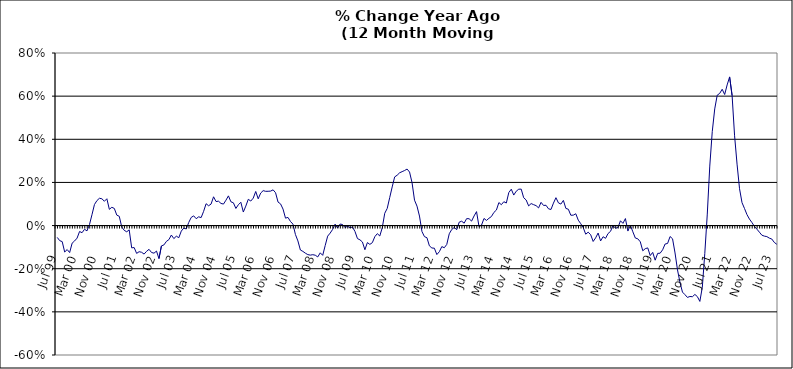
| Category | Series 0 |
|---|---|
| Jul 99 | -0.055 |
| Aug 99 | -0.07 |
| Sep 99 | -0.074 |
| Oct 99 | -0.123 |
| Nov 99 | -0.111 |
| Dec 99 | -0.125 |
| Jan 00 | -0.082 |
| Feb 00 | -0.071 |
| Mar 00 | -0.058 |
| Apr 00 | -0.027 |
| May 00 | -0.033 |
| Jun 00 | -0.017 |
| Jul 00 | -0.025 |
| Aug 00 | 0.005 |
| Sep 00 | 0.05 |
| Oct 00 | 0.098 |
| Nov 00 | 0.116 |
| Dec 00 | 0.127 |
| Jan 01 | 0.124 |
| Feb 01 | 0.113 |
| Mar 01 | 0.124 |
| Apr 01 | 0.075 |
| May 01 | 0.085 |
| Jun 01 | 0.08 |
| Jul 01 | 0.048 |
| Aug 01 | 0.043 |
| Sep 01 | -0.007 |
| Oct 01 | -0.022 |
| Nov 01 | -0.029 |
| Dec 01 | -0.02 |
| Jan 02 | -0.103 |
| Feb 02 | -0.102 |
| Mar 02 | -0.129 |
| Apr 02 | -0.121 |
| May 02 | -0.124 |
| Jun 02 | -0.132 |
| Jul 02 | -0.119 |
| Aug 02 | -0.11 |
| Sep 02 | -0.125 |
| Oct 02 | -0.128 |
| Nov 02 | -0.118 |
| Dec 02 | -0.153 |
| Jan 03 | -0.094 |
| Feb 03 | -0.09 |
| Mar 03 | -0.073 |
| Apr 03 | -0.065 |
| May 03 | -0.044 |
| Jun 03 | -0.06 |
| Jul 03 | -0.049 |
| Aug 03 | -0.056 |
| Sep 03 | -0.026 |
| Oct 03 | -0.012 |
| Nov 03 | -0.016 |
| Dec 03 | 0.014 |
| Jan 04 | 0.038 |
| Feb 04 | 0.045 |
| Mar 04 | 0.032 |
| Apr 04 | 0.041 |
| May 04 | 0.037 |
| Jun 04 | 0.066 |
| Jul 04 | 0.101 |
| Aug 04 | 0.092 |
| Sep 04 | 0.1 |
| Oct 04 | 0.133 |
| Nov 04 | 0.111 |
| Dec 04 | 0.113 |
| Jan 05 | 0.103 |
| Feb 05 | 0.1 |
| Mar 05 | 0.118 |
| Apr 05 | 0.138 |
| May 05 | 0.11 |
| Jun 05 | 0.106 |
| Jul 05 | 0.079 |
| Aug 05 | 0.097 |
| Sep 05 | 0.108 |
| Oct 05 | 0.063 |
| Nov 05 | 0.09 |
| Dec 05 | 0.122 |
| Jan 06 | 0.114 |
| Feb 06 | 0.127 |
| Mar 06 | 0.158 |
| Apr 06 | 0.124 |
| May 06 | 0.151 |
| Jun 06 | 0.162 |
| Jul 06 | 0.159 |
| Aug 06 | 0.159 |
| Sep 06 | 0.16 |
| Oct 06 | 0.166 |
| Nov 06 | 0.152 |
| Dec 06 | 0.109 |
| Jan 07 | 0.101 |
| Feb 07 | 0.076 |
| Mar 07 | 0.034 |
| Apr 07 | 0.038 |
| May 07 | 0.019 |
| Jun 07 | 0.007 |
| Jul 07 | -0.041 |
| Aug 07 | -0.071 |
| Sep 07 | -0.113 |
| Oct 07 | -0.12 |
| Nov 07 | -0.128 |
| Dec 07 | -0.135 |
| Jan 08 | -0.137 |
| Feb 08 | -0.135 |
| Mar 08 | -0.137 |
| Apr 08 | -0.145 |
| May 08 | -0.126 |
| Jun 08 | -0.138 |
| Jul 08 | -0.093 |
| Aug 08 | -0.049 |
| Sep-08 | -0.035 |
| Oct 08 | -0.018 |
| Nov 08 | 0.007 |
| Dec 08 | -0.011 |
| Jan 09 | 0.007 |
| Feb 09 | 0.005 |
| Mar 09 | -0.009 |
| Apr 09 | -0.003 |
| May 09 | -0.01 |
| Jun 09 | -0.007 |
| Jul 09 | -0.027 |
| Aug 09 | -0.06 |
| Sep 09 | -0.066 |
| Oct 09 | -0.076 |
| Nov 09 | -0.112 |
| Dec 09 | -0.079 |
| Jan 10 | -0.087 |
| Feb 10 | -0.079 |
| Mar 10 | -0.052 |
| Apr 10 | -0.037 |
| May 10 | -0.048 |
| Jun 10 | -0.01 |
| Jul 10 | 0.057 |
| Aug 10 | 0.08 |
| Sep 10 | 0.13 |
| Oct 10 | 0.179 |
| Nov 10 | 0.226 |
| Dec 10 | 0.233 |
| Jan 11 | 0.245 |
| Feb 11 | 0.25 |
| Mar 11 | 0.255 |
| Apr 11 | 0.262 |
| May 11 | 0.248 |
| Jun 11 | 0.199 |
| Jul 11 | 0.118 |
| Aug 11 | 0.09 |
| Sep 11 | 0.044 |
| Oct 11 | -0.028 |
| Nov 11 | -0.051 |
| Dec 11 | -0.056 |
| Jan 12 | -0.094 |
| Feb 12 | -0.104 |
| Mar 12 | -0.105 |
| Apr 12 | -0.134 |
| May 12 | -0.121 |
| Jun 12 | -0.098 |
| Jul 12 | -0.103 |
| Aug 12 | -0.087 |
| Sep 12 | -0.038 |
| Oct 12 | -0.018 |
| Nov 12 | -0.009 |
| Dec 12 | -0.019 |
| Jan 13 | 0.016 |
| Feb-13 | 0.02 |
| Mar-13 | 0.011 |
| Apr 13 | 0.032 |
| May 13 | 0.032 |
| Jun-13 | 0.021 |
| Jul 13 | 0.045 |
| Aug 13 | 0.065 |
| Sep 13 | -0.005 |
| Oct 13 | 0.002 |
| Nov 13 | 0.033 |
| Dec 13 | 0.024 |
| Jan 14 | 0.034 |
| Feb-14 | 0.042 |
| Mar 14 | 0.061 |
| Apr 14 | 0.072 |
| May 14 | 0.107 |
| Jun 14 | 0.097 |
| Jul-14 | 0.111 |
| Aug-14 | 0.105 |
| Sep 14 | 0.153 |
| Oct 14 | 0.169 |
| Nov 14 | 0.141 |
| Dec 14 | 0.159 |
| Jan 15 | 0.169 |
| Feb 15 | 0.169 |
| Mar 15 | 0.129 |
| Apr-15 | 0.118 |
| May 15 | 0.091 |
| Jun-15 | 0.102 |
| Jul 15 | 0.097 |
| Aug 15 | 0.092 |
| Sep 15 | 0.082 |
| Oct 15 | 0.108 |
| Nov 15 | 0.093 |
| Dec 15 | 0.094 |
| Jan 16 | 0.078 |
| Feb 16 | 0.075 |
| Mar 16 | 0.104 |
| Apr 16 | 0.129 |
| May 16 | 0.105 |
| Jun 16 | 0.1 |
| Jul 16 | 0.117 |
| Aug 16 | 0.08 |
| Sep 16 | 0.076 |
| Oct 16 | 0.048 |
| Nov 16 | 0.048 |
| Dec 16 | 0.055 |
| Jan 17 | 0.025 |
| Feb 17 | 0.009 |
| Mar 17 | -0.01 |
| Apr 17 | -0.04 |
| May 17 | -0.031 |
| Jun 17 | -0.042 |
| Jul 17 | -0.074 |
| Aug 17 | -0.057 |
| Sep 17 | -0.035 |
| Oct 17 | -0.071 |
| Nov 17 | -0.052 |
| Dec 17 | -0.059 |
| Jan 18 | -0.037 |
| Feb 18 | -0.027 |
| Mar 18 | 0 |
| Apr 18 | -0.012 |
| May 18 | -0.009 |
| Jun 18 | 0.022 |
| Jul 18 | 0.01 |
| Aug 18 | 0.033 |
| Sep 18 | -0.025 |
| Oct 18 | 0.002 |
| Nov 18 | -0.029 |
| Dec 18 | -0.058 |
| Jan 19 | -0.061 |
| Feb 19 | -0.075 |
| Mar 19 | -0.117 |
| Apr 19 | -0.107 |
| May 19 | -0.104 |
| Jun 19 | -0.139 |
| Jul 19 | -0.124 |
| Aug 19 | -0.16 |
| Sep 19 | -0.129 |
| Oct 19 | -0.128 |
| Nov 19 | -0.112 |
| Dec 19 | -0.085 |
| Jan 20 | -0.083 |
| Feb 20 | -0.051 |
| Mar 20 | -0.061 |
| Apr 20 | -0.127 |
| May 20 | -0.206 |
| Jun 20 | -0.264 |
| Jul 20 | -0.308 |
| Aug 20 | -0.32 |
| Sep 20 | -0.333 |
| Oct 20 | -0.329 |
| Nov 20 | -0.33 |
| Dec 20 | -0.319 |
| Jan 21 | -0.329 |
| Feb 21 | -0.352 |
| Mar 21 | -0.286 |
| Apr 21 | -0.129 |
| May 21 | 0.053 |
| Jun 21 | 0.276 |
| Jul 21 | 0.435 |
| Aug 21 | 0.541 |
| Sep 21 | 0.604 |
| Oct 21 | 0.613 |
| Nov 21 | 0.632 |
| Dec 21 | 0.608 |
| Jan 22 | 0.652 |
| Feb 22 | 0.689 |
| Mar 22 | 0.603 |
| Apr 22 | 0.416 |
| May 22 | 0.285 |
| Jun 22 | 0.171 |
| Jul 22 | 0.106 |
| Aug 22 | 0.079 |
| Sep 22 | 0.051 |
| Oct 22 | 0.03 |
| Nov 22 | 0.014 |
| Dec 22 | -0.004 |
| Jan 23 | -0.017 |
| Feb 23 | -0.031 |
| Mar 23 | -0.045 |
| Apr 23 | -0.049 |
| May 23 | -0.051 |
| Jun 23 | -0.058 |
| Jul 23 | -0.062 |
| Aug 23 | -0.078 |
| Sep 23 | -0.087 |